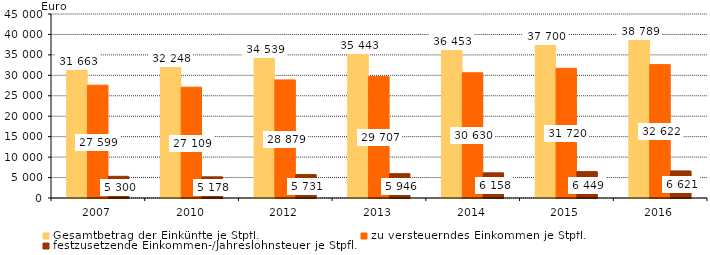
| Category | Gesamtbetrag der Einkünfte je Stpfl. | zu versteuerndes Einkommen je Stpfl. | festzusetzende Einkommen-/Jahreslohnsteuer je Stpfl. |
|---|---|---|---|
| 2007.0 | 31663 | 27599 | 5300 |
| 2010.0 | 32248 | 27109 | 5178 |
| 2012.0 | 34539 | 28879 | 5731 |
| 2013.0 | 35443 | 29707 | 5946 |
| 2014.0 | 36453 | 30630 | 6158 |
| 2015.0 | 37700 | 31720 | 6449 |
| 2016.0 | 38789 | 32622 | 6621 |